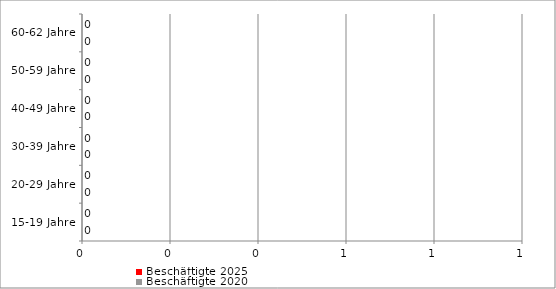
| Category | Beschäftigte 2020 | Beschäftigte 2025 |
|---|---|---|
| 15-19 Jahre | 7 | 0 |
| 20-29 Jahre | 6 | 8 |
| 30-39 Jahre | 15 | 10 |
| 40-49 Jahre | 115 | 121 |
| 50-59 Jahre | 3 | 9 |
| 60-62 Jahre | 3 | 1.2 |